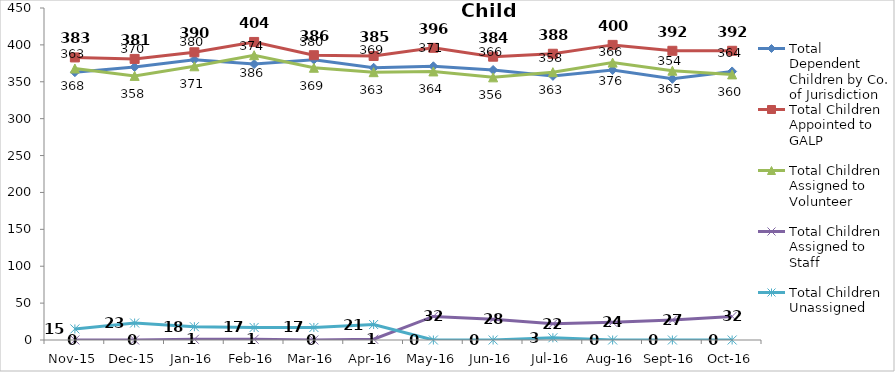
| Category | Total Dependent Children by Co. of Jurisdiction | Total Children Appointed to GALP | Total Children Assigned to Volunteer | Total Children Assigned to Staff | Total Children Unassigned |
|---|---|---|---|---|---|
| Nov-15 | 363 | 383 | 368 | 0 | 15 |
| Dec-15 | 370 | 381 | 358 | 0 | 23 |
| Jan-16 | 380 | 390 | 371 | 1 | 18 |
| Feb-16 | 374 | 404 | 386 | 1 | 17 |
| Mar-16 | 380 | 386 | 369 | 0 | 17 |
| Apr-16 | 369 | 385 | 363 | 1 | 21 |
| May-16 | 371 | 396 | 364 | 32 | 0 |
| Jun-16 | 366 | 384 | 356 | 28 | 0 |
| Jul-16 | 358 | 388 | 363 | 22 | 3 |
| Aug-16 | 366 | 400 | 376 | 24 | 0 |
| Sep-16 | 354 | 392 | 365 | 27 | 0 |
| Oct-16 | 364 | 392 | 360 | 32 | 0 |